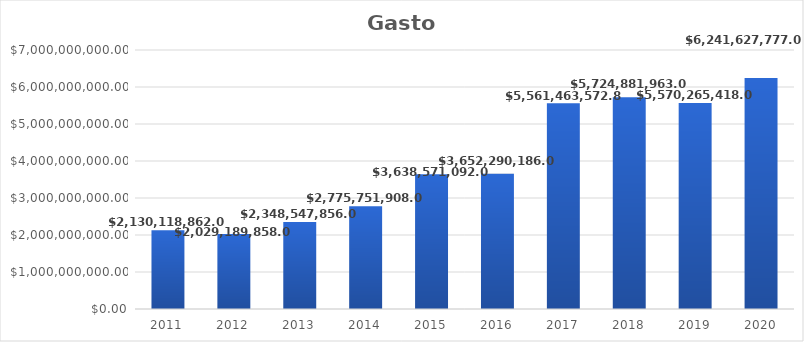
| Category | Series 0 |
|---|---|
| 2011.0 | 2130118862 |
| 2012.0 | 2029189858 |
| 2013.0 | 2348547856 |
| 2014.0 | 2775751908 |
| 2015.0 | 3638571092 |
| 2016.0 | 3652290186 |
| 2017.0 | 5561463572.87 |
| 2018.0 | 5724881963 |
| 2019.0 | 5570265418 |
| 2020.0 | 6241627777 |